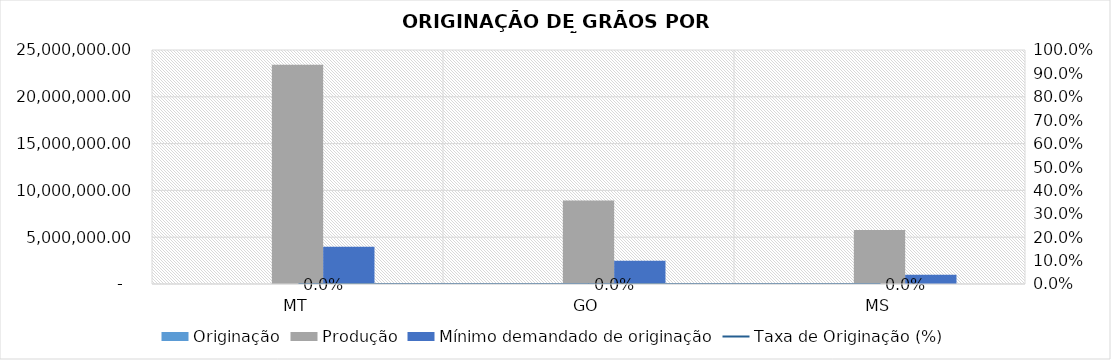
| Category | Originação | Produção | Mínimo demandado de originação |
|---|---|---|---|
| MT | 0 | 23416774 | 3975329.654 |
| GO | 0 | 8913069 | 2484581.034 |
| MS | 0 | 5780519 | 993832.413 |